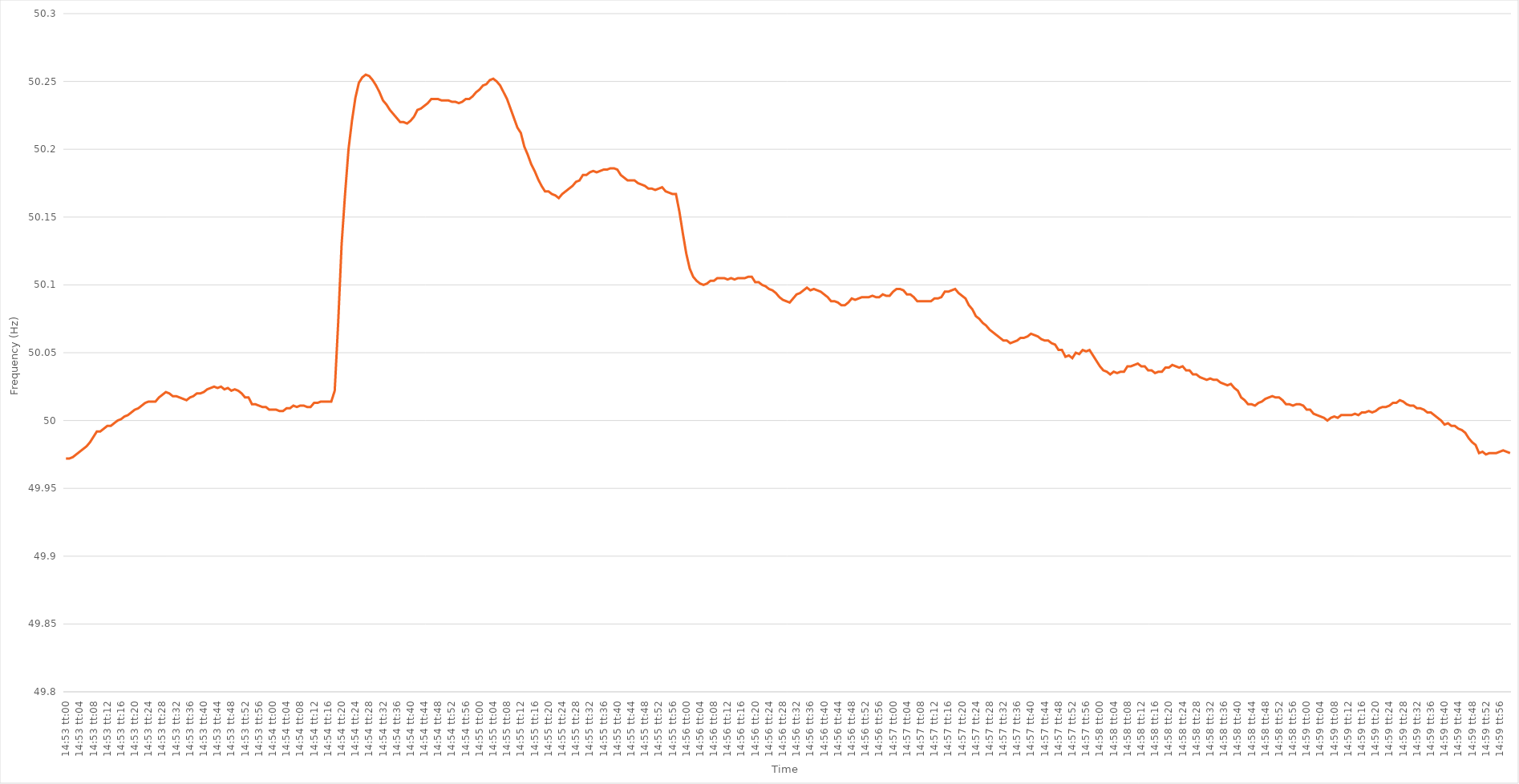
| Category | Series 0 |
|---|---|
| 0.6201388888888889 | 49.972 |
| 0.620150462962963 | 49.972 |
| 0.620162037037037 | 49.973 |
| 0.6201736111111111 | 49.975 |
| 0.6201851851851852 | 49.977 |
| 0.6201967592592593 | 49.979 |
| 0.6202083333333334 | 49.981 |
| 0.6202199074074074 | 49.984 |
| 0.6202314814814814 | 49.988 |
| 0.6202430555555556 | 49.992 |
| 0.6202546296296296 | 49.992 |
| 0.6202662037037037 | 49.994 |
| 0.6202777777777778 | 49.996 |
| 0.6202893518518519 | 49.996 |
| 0.6203009259259259 | 49.998 |
| 0.6203124999999999 | 50 |
| 0.6203240740740741 | 50.001 |
| 0.6203356481481481 | 50.003 |
| 0.6203472222222223 | 50.004 |
| 0.6203587962962963 | 50.006 |
| 0.6203703703703703 | 50.008 |
| 0.6203819444444444 | 50.009 |
| 0.6203935185185185 | 50.011 |
| 0.6204050925925926 | 50.013 |
| 0.6204166666666667 | 50.014 |
| 0.6204282407407408 | 50.014 |
| 0.6204398148148148 | 50.014 |
| 0.6204513888888888 | 50.017 |
| 0.620462962962963 | 50.019 |
| 0.620474537037037 | 50.021 |
| 0.6204861111111112 | 50.02 |
| 0.6204976851851852 | 50.018 |
| 0.6205092592592593 | 50.018 |
| 0.6205208333333333 | 50.017 |
| 0.6205324074074073 | 50.016 |
| 0.6205439814814815 | 50.015 |
| 0.6205555555555555 | 50.017 |
| 0.6205671296296297 | 50.018 |
| 0.6205787037037037 | 50.02 |
| 0.6205902777777778 | 50.02 |
| 0.6206018518518518 | 50.021 |
| 0.6206134259259259 | 50.023 |
| 0.620625 | 50.024 |
| 0.6206365740740741 | 50.025 |
| 0.6206481481481482 | 50.024 |
| 0.6206597222222222 | 50.025 |
| 0.6206712962962962 | 50.023 |
| 0.6206828703703704 | 50.024 |
| 0.6206944444444444 | 50.022 |
| 0.6207060185185186 | 50.023 |
| 0.6207175925925926 | 50.022 |
| 0.6207291666666667 | 50.02 |
| 0.6207407407407407 | 50.017 |
| 0.6207523148148147 | 50.017 |
| 0.6207638888888889 | 50.012 |
| 0.6207754629629629 | 50.012 |
| 0.6207870370370371 | 50.011 |
| 0.6207986111111111 | 50.01 |
| 0.6208101851851852 | 50.01 |
| 0.6208217592592592 | 50.008 |
| 0.6208333333333333 | 50.008 |
| 0.6208449074074074 | 50.008 |
| 0.6208564814814815 | 50.007 |
| 0.6208680555555556 | 50.007 |
| 0.6208796296296296 | 50.009 |
| 0.6208912037037037 | 50.009 |
| 0.6209027777777778 | 50.011 |
| 0.6209143518518518 | 50.01 |
| 0.620925925925926 | 50.011 |
| 0.6209375 | 50.011 |
| 0.6209490740740741 | 50.01 |
| 0.6209606481481481 | 50.01 |
| 0.6209722222222223 | 50.013 |
| 0.6209837962962963 | 50.013 |
| 0.6209953703703703 | 50.014 |
| 0.6210069444444445 | 50.014 |
| 0.6210185185185185 | 50.014 |
| 0.6210300925925926 | 50.014 |
| 0.6210416666666666 | 50.022 |
| 0.6210532407407408 | 50.072 |
| 0.6210648148148148 | 50.13 |
| 0.6210763888888889 | 50.167 |
| 0.621087962962963 | 50.2 |
| 0.621099537037037 | 50.221 |
| 0.6211111111111111 | 50.238 |
| 0.6211226851851852 | 50.249 |
| 0.6211342592592592 | 50.253 |
| 0.6211458333333334 | 50.255 |
| 0.6211574074074074 | 50.254 |
| 0.6211689814814815 | 50.251 |
| 0.6211805555555555 | 50.247 |
| 0.6211921296296297 | 50.242 |
| 0.6212037037037037 | 50.236 |
| 0.6212152777777777 | 50.233 |
| 0.6212268518518519 | 50.229 |
| 0.6212384259259259 | 50.226 |
| 0.62125 | 50.223 |
| 0.621261574074074 | 50.22 |
| 0.6212731481481482 | 50.22 |
| 0.6212847222222222 | 50.219 |
| 0.6212962962962963 | 50.221 |
| 0.6213078703703704 | 50.224 |
| 0.6213194444444444 | 50.229 |
| 0.6213310185185185 | 50.23 |
| 0.6213425925925926 | 50.232 |
| 0.6213541666666667 | 50.234 |
| 0.6213657407407408 | 50.237 |
| 0.6213773148148148 | 50.237 |
| 0.6213888888888889 | 50.237 |
| 0.6214004629629629 | 50.236 |
| 0.6214120370370371 | 50.236 |
| 0.6214236111111111 | 50.236 |
| 0.6214351851851853 | 50.235 |
| 0.6214467592592593 | 50.235 |
| 0.6214583333333333 | 50.234 |
| 0.6214699074074074 | 50.235 |
| 0.6214814814814814 | 50.237 |
| 0.6214930555555556 | 50.237 |
| 0.6215046296296296 | 50.239 |
| 0.6215162037037038 | 50.242 |
| 0.6215277777777778 | 50.244 |
| 0.6215393518518518 | 50.247 |
| 0.6215509259259259 | 50.248 |
| 0.6215625 | 50.251 |
| 0.6215740740740741 | 50.252 |
| 0.6215856481481482 | 50.25 |
| 0.6215972222222222 | 50.247 |
| 0.6216087962962963 | 50.242 |
| 0.6216203703703703 | 50.237 |
| 0.6216319444444445 | 50.23 |
| 0.6216435185185185 | 50.223 |
| 0.6216550925925927 | 50.216 |
| 0.6216666666666667 | 50.212 |
| 0.6216782407407407 | 50.202 |
| 0.6216898148148148 | 50.196 |
| 0.6217013888888888 | 50.189 |
| 0.621712962962963 | 50.184 |
| 0.621724537037037 | 50.178 |
| 0.6217361111111112 | 50.173 |
| 0.6217476851851852 | 50.169 |
| 0.6217592592592592 | 50.169 |
| 0.6217708333333333 | 50.167 |
| 0.6217824074074074 | 50.166 |
| 0.6217939814814815 | 50.164 |
| 0.6218055555555556 | 50.167 |
| 0.6218171296296297 | 50.169 |
| 0.6218287037037037 | 50.171 |
| 0.6218402777777777 | 50.173 |
| 0.6218518518518519 | 50.176 |
| 0.6218634259259259 | 50.177 |
| 0.6218750000000001 | 50.181 |
| 0.6218865740740741 | 50.181 |
| 0.6218981481481481 | 50.183 |
| 0.6219097222222222 | 50.184 |
| 0.6219212962962963 | 50.183 |
| 0.6219328703703704 | 50.184 |
| 0.6219444444444444 | 50.185 |
| 0.6219560185185186 | 50.185 |
| 0.6219675925925926 | 50.186 |
| 0.6219791666666666 | 50.186 |
| 0.6219907407407407 | 50.185 |
| 0.6220023148148148 | 50.181 |
| 0.6220138888888889 | 50.179 |
| 0.622025462962963 | 50.177 |
| 0.622037037037037 | 50.177 |
| 0.6220486111111111 | 50.177 |
| 0.6220601851851851 | 50.175 |
| 0.6220717592592593 | 50.174 |
| 0.6220833333333333 | 50.173 |
| 0.6220949074074075 | 50.171 |
| 0.6221064814814815 | 50.171 |
| 0.6221180555555555 | 50.17 |
| 0.6221296296296296 | 50.171 |
| 0.6221412037037037 | 50.172 |
| 0.6221527777777778 | 50.169 |
| 0.6221643518518518 | 50.168 |
| 0.622175925925926 | 50.167 |
| 0.6221875 | 50.167 |
| 0.622199074074074 | 50.154 |
| 0.6222106481481481 | 50.138 |
| 0.6222222222222222 | 50.123 |
| 0.6222337962962963 | 50.112 |
| 0.6222453703703704 | 50.106 |
| 0.6222569444444445 | 50.103 |
| 0.6222685185185185 | 50.101 |
| 0.6222800925925925 | 50.1 |
| 0.6222916666666667 | 50.101 |
| 0.6223032407407407 | 50.103 |
| 0.6223148148148149 | 50.103 |
| 0.6223263888888889 | 50.105 |
| 0.622337962962963 | 50.105 |
| 0.622349537037037 | 50.105 |
| 0.6223611111111111 | 50.104 |
| 0.6223726851851852 | 50.105 |
| 0.6223842592592593 | 50.104 |
| 0.6223958333333334 | 50.105 |
| 0.6224074074074074 | 50.105 |
| 0.6224189814814814 | 50.105 |
| 0.6224305555555555 | 50.106 |
| 0.6224421296296296 | 50.106 |
| 0.6224537037037037 | 50.102 |
| 0.6224652777777778 | 50.102 |
| 0.6224768518518519 | 50.1 |
| 0.6224884259259259 | 50.099 |
| 0.6224999999999999 | 50.097 |
| 0.6225115740740741 | 50.096 |
| 0.6225231481481481 | 50.094 |
| 0.6225347222222223 | 50.091 |
| 0.6225462962962963 | 50.089 |
| 0.6225578703703704 | 50.088 |
| 0.6225694444444444 | 50.087 |
| 0.6225810185185185 | 50.09 |
| 0.6225925925925926 | 50.093 |
| 0.6226041666666667 | 50.094 |
| 0.6226157407407408 | 50.096 |
| 0.6226273148148148 | 50.098 |
| 0.6226388888888889 | 50.096 |
| 0.6226504629629629 | 50.097 |
| 0.622662037037037 | 50.096 |
| 0.6226736111111111 | 50.095 |
| 0.6226851851851852 | 50.093 |
| 0.6226967592592593 | 50.091 |
| 0.6227083333333333 | 50.088 |
| 0.6227199074074073 | 50.088 |
| 0.6227314814814815 | 50.087 |
| 0.6227430555555555 | 50.085 |
| 0.6227546296296297 | 50.085 |
| 0.6227662037037037 | 50.087 |
| 0.6227777777777778 | 50.09 |
| 0.6227893518518518 | 50.089 |
| 0.622800925925926 | 50.09 |
| 0.6228125 | 50.091 |
| 0.6228240740740741 | 50.091 |
| 0.6228356481481482 | 50.091 |
| 0.6228472222222222 | 50.092 |
| 0.6228587962962963 | 50.091 |
| 0.6228703703703703 | 50.091 |
| 0.6228819444444444 | 50.093 |
| 0.6228935185185185 | 50.092 |
| 0.6229050925925926 | 50.092 |
| 0.6229166666666667 | 50.095 |
| 0.6229282407407407 | 50.097 |
| 0.6229398148148148 | 50.097 |
| 0.6229513888888889 | 50.096 |
| 0.6229629629629629 | 50.093 |
| 0.6229745370370371 | 50.093 |
| 0.6229861111111111 | 50.091 |
| 0.6229976851851852 | 50.088 |
| 0.6230092592592592 | 50.088 |
| 0.6230208333333334 | 50.088 |
| 0.6230324074074074 | 50.088 |
| 0.6230439814814815 | 50.088 |
| 0.6230555555555556 | 50.09 |
| 0.6230671296296296 | 50.09 |
| 0.6230787037037037 | 50.091 |
| 0.6230902777777778 | 50.095 |
| 0.6231018518518519 | 50.095 |
| 0.6231134259259259 | 50.096 |
| 0.623125 | 50.097 |
| 0.6231365740740741 | 50.094 |
| 0.6231481481481481 | 50.092 |
| 0.6231597222222222 | 50.09 |
| 0.6231712962962963 | 50.085 |
| 0.6231828703703703 | 50.082 |
| 0.6231944444444445 | 50.077 |
| 0.6232060185185185 | 50.075 |
| 0.6232175925925926 | 50.072 |
| 0.6232291666666666 | 50.07 |
| 0.6232407407407408 | 50.067 |
| 0.6232523148148148 | 50.065 |
| 0.623263888888889 | 50.063 |
| 0.623275462962963 | 50.061 |
| 0.623287037037037 | 50.059 |
| 0.6232986111111111 | 50.059 |
| 0.6233101851851852 | 50.057 |
| 0.6233217592592593 | 50.058 |
| 0.6233333333333334 | 50.059 |
| 0.6233449074074074 | 50.061 |
| 0.6233564814814815 | 50.061 |
| 0.6233680555555555 | 50.062 |
| 0.6233796296296296 | 50.064 |
| 0.6233912037037037 | 50.063 |
| 0.6234027777777778 | 50.062 |
| 0.6234143518518519 | 50.06 |
| 0.6234259259259259 | 50.059 |
| 0.6234375 | 50.059 |
| 0.623449074074074 | 50.057 |
| 0.6234606481481482 | 50.056 |
| 0.6234722222222222 | 50.052 |
| 0.6234837962962964 | 50.052 |
| 0.6234953703703704 | 50.047 |
| 0.6235069444444444 | 50.048 |
| 0.6235185185185185 | 50.046 |
| 0.6235300925925926 | 50.05 |
| 0.6235416666666667 | 50.049 |
| 0.6235532407407408 | 50.052 |
| 0.6235648148148148 | 50.051 |
| 0.6235763888888889 | 50.052 |
| 0.6235879629629629 | 50.048 |
| 0.623599537037037 | 50.044 |
| 0.6236111111111111 | 50.04 |
| 0.6236226851851852 | 50.037 |
| 0.6236342592592593 | 50.036 |
| 0.6236458333333333 | 50.034 |
| 0.6236574074074074 | 50.036 |
| 0.6236689814814814 | 50.035 |
| 0.6236805555555556 | 50.036 |
| 0.6236921296296296 | 50.036 |
| 0.6237037037037038 | 50.04 |
| 0.6237152777777778 | 50.04 |
| 0.6237268518518518 | 50.041 |
| 0.6237384259259259 | 50.042 |
| 0.62375 | 50.04 |
| 0.6237615740740741 | 50.04 |
| 0.6237731481481482 | 50.037 |
| 0.6237847222222223 | 50.037 |
| 0.6237962962962963 | 50.035 |
| 0.6238078703703703 | 50.036 |
| 0.6238194444444444 | 50.036 |
| 0.6238310185185185 | 50.039 |
| 0.6238425925925926 | 50.039 |
| 0.6238541666666667 | 50.041 |
| 0.6238657407407407 | 50.04 |
| 0.6238773148148148 | 50.039 |
| 0.6238888888888888 | 50.04 |
| 0.623900462962963 | 50.037 |
| 0.623912037037037 | 50.037 |
| 0.6239236111111112 | 50.034 |
| 0.6239351851851852 | 50.034 |
| 0.6239467592592592 | 50.032 |
| 0.6239583333333333 | 50.031 |
| 0.6239699074074074 | 50.03 |
| 0.6239814814814815 | 50.031 |
| 0.6239930555555556 | 50.03 |
| 0.6240046296296297 | 50.03 |
| 0.6240162037037037 | 50.028 |
| 0.6240277777777777 | 50.027 |
| 0.6240393518518519 | 50.026 |
| 0.6240509259259259 | 50.027 |
| 0.6240625 | 50.024 |
| 0.6240740740740741 | 50.022 |
| 0.6240856481481482 | 50.017 |
| 0.6240972222222222 | 50.015 |
| 0.6241087962962962 | 50.012 |
| 0.6241203703703704 | 50.012 |
| 0.6241319444444444 | 50.011 |
| 0.6241435185185186 | 50.013 |
| 0.6241550925925926 | 50.014 |
| 0.6241666666666666 | 50.016 |
| 0.6241782407407407 | 50.017 |
| 0.6241898148148148 | 50.018 |
| 0.6242013888888889 | 50.017 |
| 0.624212962962963 | 50.017 |
| 0.6242245370370371 | 50.015 |
| 0.6242361111111111 | 50.012 |
| 0.6242476851851851 | 50.012 |
| 0.6242592592592593 | 50.011 |
| 0.6242708333333333 | 50.012 |
| 0.6242824074074075 | 50.012 |
| 0.6242939814814815 | 50.011 |
| 0.6243055555555556 | 50.008 |
| 0.6243171296296296 | 50.008 |
| 0.6243287037037036 | 50.005 |
| 0.6243402777777778 | 50.004 |
| 0.6243518518518518 | 50.003 |
| 0.624363425925926 | 50.002 |
| 0.624375 | 50 |
| 0.624386574074074 | 50.002 |
| 0.6243981481481481 | 50.003 |
| 0.6244097222222222 | 50.002 |
| 0.6244212962962963 | 50.004 |
| 0.6244328703703704 | 50.004 |
| 0.6244444444444445 | 50.004 |
| 0.6244560185185185 | 50.004 |
| 0.6244675925925925 | 50.005 |
| 0.6244791666666667 | 50.004 |
| 0.6244907407407407 | 50.006 |
| 0.6245023148148149 | 50.006 |
| 0.6245138888888889 | 50.007 |
| 0.624525462962963 | 50.006 |
| 0.624537037037037 | 50.007 |
| 0.624548611111111 | 50.009 |
| 0.6245601851851852 | 50.01 |
| 0.6245717592592592 | 50.01 |
| 0.6245833333333334 | 50.011 |
| 0.6245949074074074 | 50.013 |
| 0.6246064814814815 | 50.013 |
| 0.6246180555555555 | 50.015 |
| 0.6246296296296296 | 50.014 |
| 0.6246412037037037 | 50.012 |
| 0.6246527777777778 | 50.011 |
| 0.6246643518518519 | 50.011 |
| 0.6246759259259259 | 50.009 |
| 0.6246875 | 50.009 |
| 0.6246990740740741 | 50.008 |
| 0.6247106481481481 | 50.006 |
| 0.6247222222222223 | 50.006 |
| 0.6247337962962963 | 50.004 |
| 0.6247453703703704 | 50.002 |
| 0.6247569444444444 | 50 |
| 0.6247685185185184 | 49.997 |
| 0.6247800925925926 | 49.998 |
| 0.6247916666666666 | 49.996 |
| 0.6248032407407408 | 49.996 |
| 0.6248148148148148 | 49.994 |
| 0.6248263888888889 | 49.993 |
| 0.6248379629629629 | 49.991 |
| 0.624849537037037 | 49.987 |
| 0.6248611111111111 | 49.984 |
| 0.6248726851851852 | 49.982 |
| 0.6248842592592593 | 49.976 |
| 0.6248958333333333 | 49.977 |
| 0.6249074074074074 | 49.975 |
| 0.6249189814814815 | 49.976 |
| 0.6249305555555555 | 49.976 |
| 0.6249421296296297 | 49.976 |
| 0.6249537037037037 | 49.977 |
| 0.6249652777777778 | 49.978 |
| 0.6249768518518518 | 49.977 |
| 0.624988425925926 | 49.976 |